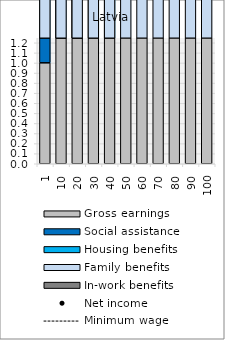
| Category | Gross earnings | Social assistance | Housing benefits | Family benefits | In-work benefits |
|---|---|---|---|---|---|
| 1.0 | 1.001 | 23.321 | 16.896 | 4.276 | 0 |
| 10.0 | 10.002 | 15.269 | 16.896 | 4.276 | 0 |
| 20.0 | 20.004 | 6.32 | 16.896 | 4.276 | 0 |
| 30.0 | 29.996 | 0 | 14.268 | 4.276 | 0 |
| 40.0 | 39.998 | 0 | 5.319 | 4.276 | 0 |
| 50.0 | 50 | 0 | 0 | 4.276 | 0 |
| 60.0 | 60.002 | 0 | 0 | 4.276 | 0 |
| 70.0 | 70.004 | 0 | 0 | 4.276 | 0 |
| 80.0 | 79.996 | 0 | 0 | 4.276 | 0 |
| 90.0 | 89.998 | 0 | 0 | 4.276 | 0 |
| 100.0 | 100 | 0 | 0 | 4.276 | 0 |